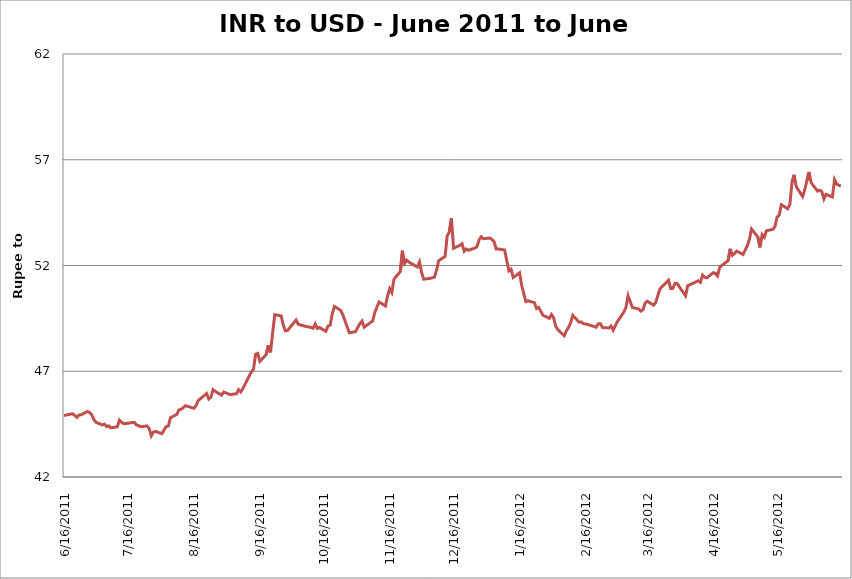
| Category | Rupee to Dollar |
|---|---|
| 6/15/12 | 55.763 |
| 6/14/12 | 55.794 |
| 6/13/12 | 55.85 |
| 6/12/12 | 56.054 |
| 6/11/12 | 55.238 |
| 6/8/12 | 55.364 |
| 6/7/12 | 55.146 |
| 6/6/12 | 55.496 |
| 6/5/12 | 55.562 |
| 6/4/12 | 55.516 |
| 6/1/12 | 55.918 |
| 5/31/12 | 56.422 |
| 5/30/12 | 56.006 |
| 5/29/12 | 55.584 |
| 5/28/12 | 55.262 |
| 5/25/12 | 55.725 |
| 5/24/12 | 56.287 |
| 5/23/12 | 55.93 |
| 5/22/12 | 54.884 |
| 5/21/12 | 54.681 |
| 5/18/12 | 54.876 |
| 5/17/12 | 54.388 |
| 5/16/12 | 54.292 |
| 5/15/12 | 53.84 |
| 5/14/12 | 53.712 |
| 5/11/12 | 53.641 |
| 5/10/12 | 53.338 |
| 5/9/12 | 53.46 |
| 5/8/12 | 52.855 |
| 5/7/12 | 53.342 |
| 5/4/12 | 53.722 |
| 5/3/12 | 53.24 |
| 5/2/12 | 52.93 |
| 4/30/12 | 52.519 |
| 4/27/12 | 52.681 |
| 4/26/12 | 52.567 |
| 4/25/12 | 52.485 |
| 4/24/12 | 52.791 |
| 4/23/12 | 52.23 |
| 4/20/12 | 52 |
| 4/19/12 | 51.893 |
| 4/18/12 | 51.504 |
| 4/17/12 | 51.626 |
| 4/16/12 | 51.659 |
| 4/13/12 | 51.418 |
| 4/12/12 | 51.442 |
| 4/11/12 | 51.547 |
| 4/10/12 | 51.204 |
| 4/9/12 | 51.276 |
| 4/4/12 | 51.046 |
| 4/3/12 | 50.564 |
| 3/30/12 | 51.156 |
| 3/29/12 | 51.145 |
| 3/28/12 | 50.918 |
| 3/27/12 | 50.908 |
| 3/26/12 | 51.309 |
| 3/22/12 | 50.906 |
| 3/21/12 | 50.594 |
| 3/20/12 | 50.254 |
| 3/19/12 | 50.124 |
| 3/16/12 | 50.313 |
| 3/15/12 | 50.222 |
| 3/14/12 | 49.903 |
| 3/13/12 | 49.845 |
| 3/12/12 | 49.945 |
| 3/9/12 | 50.015 |
| 3/7/12 | 50.573 |
| 3/6/12 | 50.026 |
| 3/5/12 | 49.796 |
| 3/2/12 | 49.352 |
| 3/1/12 | 49.154 |
| 2/29/12 | 48.941 |
| 2/28/12 | 49.143 |
| 2/27/12 | 49.048 |
| 2/24/12 | 49.065 |
| 2/23/12 | 49.245 |
| 2/22/12 | 49.245 |
| 2/21/12 | 49.084 |
| 2/17/12 | 49.213 |
| 2/15/12 | 49.252 |
| 2/14/12 | 49.331 |
| 2/13/12 | 49.318 |
| 2/10/12 | 49.644 |
| 2/9/12 | 49.29 |
| 2/8/12 | 49.068 |
| 2/7/12 | 48.915 |
| 2/6/12 | 48.679 |
| 2/3/12 | 48.964 |
| 2/2/12 | 49.129 |
| 2/1/12 | 49.532 |
| 1/31/12 | 49.682 |
| 1/30/12 | 49.503 |
| 1/27/12 | 49.648 |
| 1/25/12 | 50.022 |
| 1/24/12 | 49.967 |
| 1/23/12 | 50.244 |
| 1/20/12 | 50.329 |
| 1/19/12 | 50.289 |
| 1/18/12 | 50.666 |
| 1/17/12 | 51.065 |
| 1/16/12 | 51.654 |
| 1/13/12 | 51.431 |
| 1/12/12 | 51.829 |
| 1/11/12 | 51.75 |
| 1/10/12 | 52.226 |
| 1/9/12 | 52.732 |
| 1/6/12 | 52.784 |
| 1/5/12 | 52.781 |
| 1/4/12 | 53.14 |
| 1/3/12 | 53.229 |
| 1/2/12 | 53.298 |
| 12/30/11 | 53.266 |
| 12/29/11 | 53.358 |
| 12/28/11 | 53.214 |
| 12/27/11 | 52.894 |
| 12/26/11 | 52.82 |
| 12/23/11 | 52.722 |
| 12/22/11 | 52.782 |
| 12/21/11 | 52.675 |
| 12/20/11 | 53.027 |
| 12/19/11 | 52.958 |
| 12/16/11 | 52.814 |
| 12/15/11 | 54.236 |
| 12/14/11 | 53.577 |
| 12/13/11 | 53.403 |
| 12/12/11 | 52.424 |
| 12/9/11 | 52.228 |
| 12/8/11 | 51.778 |
| 12/7/11 | 51.449 |
| 12/5/11 | 51.392 |
| 12/2/11 | 51.352 |
| 12/1/11 | 51.652 |
| 11/30/11 | 52.165 |
| 11/29/11 | 51.931 |
| 11/28/11 | 51.983 |
| 11/25/11 | 52.166 |
| 11/24/11 | 52.25 |
| 11/23/11 | 52.1 |
| 11/22/11 | 52.702 |
| 11/21/11 | 51.716 |
| 11/18/11 | 51.353 |
| 11/17/11 | 50.722 |
| 11/16/11 | 50.901 |
| 11/15/11 | 50.564 |
| 11/14/11 | 50.084 |
| 11/11/11 | 50.28 |
| 11/9/11 | 49.781 |
| 11/8/11 | 49.38 |
| 11/4/11 | 49.084 |
| 11/3/11 | 49.375 |
| 11/2/11 | 49.251 |
| 11/1/11 | 49.078 |
| 10/31/11 | 48.873 |
| 10/28/11 | 48.821 |
| 10/25/11 | 49.66 |
| 10/24/11 | 49.874 |
| 10/21/11 | 50.067 |
| 10/20/11 | 49.711 |
| 10/19/11 | 49.178 |
| 10/18/11 | 49.136 |
| 10/17/11 | 48.892 |
| 10/14/11 | 49.068 |
| 10/13/11 | 49.023 |
| 10/12/11 | 49.241 |
| 10/11/11 | 49.033 |
| 10/10/11 | 49.071 |
| 10/7/11 | 49.136 |
| 10/5/11 | 49.192 |
| 10/4/11 | 49.225 |
| 10/3/11 | 49.424 |
| 9/29/11 | 48.925 |
| 9/28/11 | 48.912 |
| 9/27/11 | 49.178 |
| 9/26/11 | 49.617 |
| 9/23/11 | 49.673 |
| 9/22/11 | 48.82 |
| 9/21/11 | 47.89 |
| 9/20/11 | 48.222 |
| 9/19/11 | 47.792 |
| 9/16/11 | 47.467 |
| 9/15/11 | 47.844 |
| 9/14/11 | 47.806 |
| 9/13/11 | 47.096 |
| 9/12/11 | 46.974 |
| 9/9/11 | 46.384 |
| 9/8/11 | 46.178 |
| 9/7/11 | 46.022 |
| 9/6/11 | 46.127 |
| 9/5/11 | 45.938 |
| 9/2/11 | 45.896 |
| 8/30/11 | 46.019 |
| 8/29/11 | 45.871 |
| 8/26/11 | 46.053 |
| 8/25/11 | 46.128 |
| 8/24/11 | 45.77 |
| 8/23/11 | 45.689 |
| 8/22/11 | 45.948 |
| 8/18/11 | 45.61 |
| 8/17/11 | 45.37 |
| 8/16/11 | 45.249 |
| 8/12/11 | 45.374 |
| 8/11/11 | 45.271 |
| 8/10/11 | 45.206 |
| 8/9/11 | 45.174 |
| 8/8/11 | 44.962 |
| 8/5/11 | 44.803 |
| 8/4/11 | 44.416 |
| 8/3/11 | 44.38 |
| 8/2/11 | 44.229 |
| 8/1/11 | 44.048 |
| 7/29/11 | 44.155 |
| 7/28/11 | 44.126 |
| 7/27/11 | 43.948 |
| 7/26/11 | 44.287 |
| 7/25/11 | 44.416 |
| 7/22/11 | 44.376 |
| 7/21/11 | 44.433 |
| 7/20/11 | 44.46 |
| 7/19/11 | 44.587 |
| 7/18/11 | 44.574 |
| 7/15/11 | 44.526 |
| 7/14/11 | 44.528 |
| 7/13/11 | 44.588 |
| 7/12/11 | 44.688 |
| 7/11/11 | 44.37 |
| 7/8/11 | 44.326 |
| 7/7/11 | 44.417 |
| 7/6/11 | 44.383 |
| 7/5/11 | 44.499 |
| 7/4/11 | 44.46 |
| 7/1/11 | 44.586 |
| 6/30/11 | 44.72 |
| 6/29/11 | 44.94 |
| 6/28/11 | 45.05 |
| 6/27/11 | 45.1 |
| 6/24/11 | 44.94 |
| 6/23/11 | 44.93 |
| 6/22/11 | 44.82 |
| 6/21/11 | 44.91 |
| 6/20/11 | 44.99 |
| 6/17/11 | 44.93 |
| 6/16/11 | 44.9 |